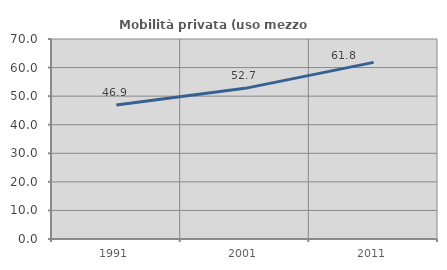
| Category | Mobilità privata (uso mezzo privato) |
|---|---|
| 1991.0 | 46.939 |
| 2001.0 | 52.724 |
| 2011.0 | 61.818 |